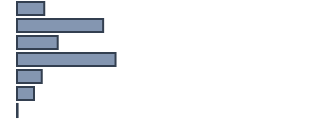
| Category | Series 0 |
|---|---|
| 0 | 9.2 |
| 1 | 29.2 |
| 2 | 13.8 |
| 3 | 33.4 |
| 4 | 8.4 |
| 5 | 5.8 |
| 6 | 0.2 |